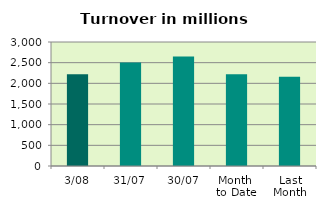
| Category | Series 0 |
|---|---|
| 3/08 | 2218.407 |
| 31/07 | 2502.556 |
| 30/07 | 2650.801 |
| Month 
to Date | 2218.407 |
| Last
Month | 2162.227 |